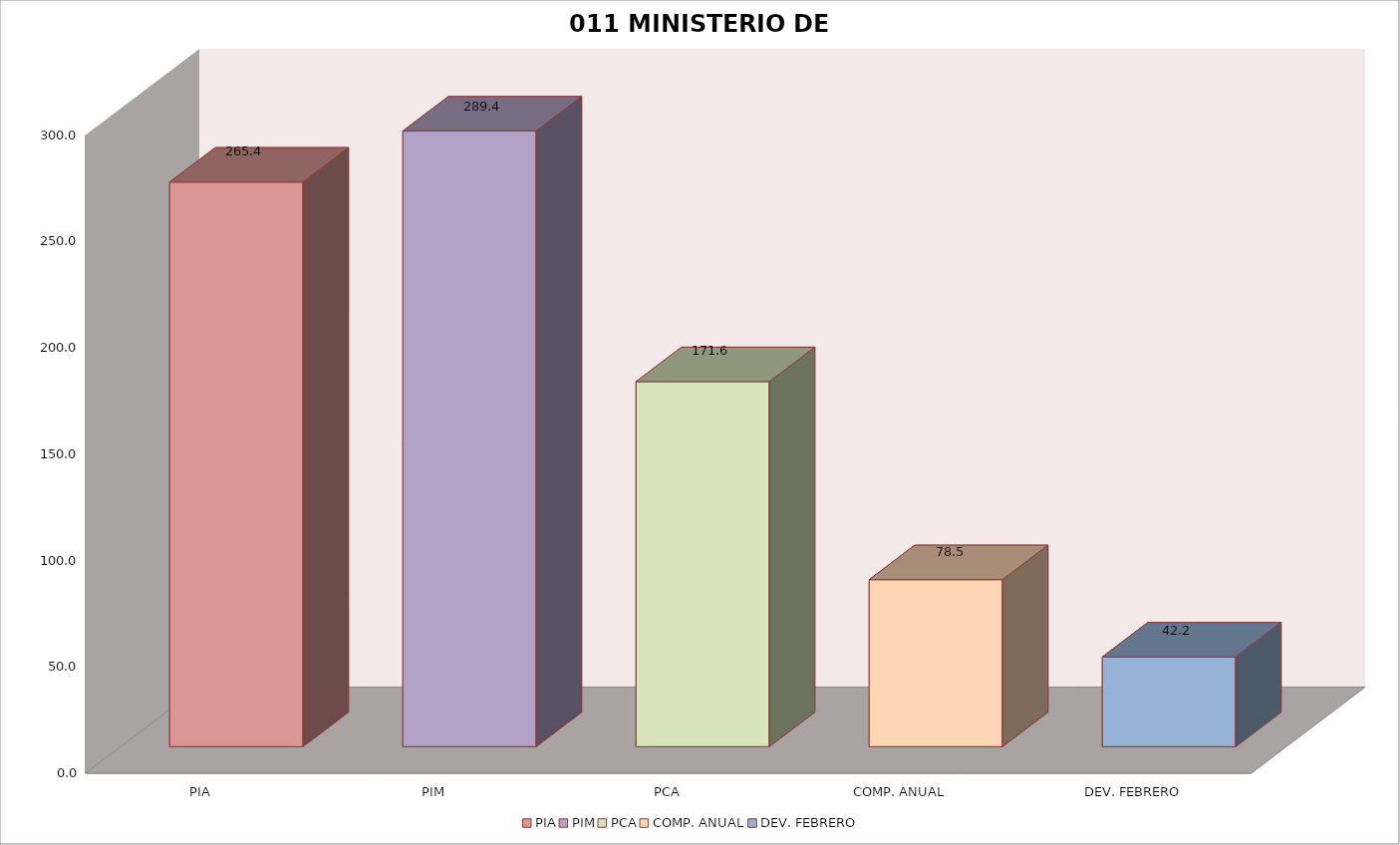
| Category | 011 MINISTERIO DE SALUD |
|---|---|
| PIA | 265.378 |
| PIM | 289.406 |
| PCA | 171.571 |
| COMP. ANUAL | 78.488 |
| DEV. FEBRERO | 42.207 |